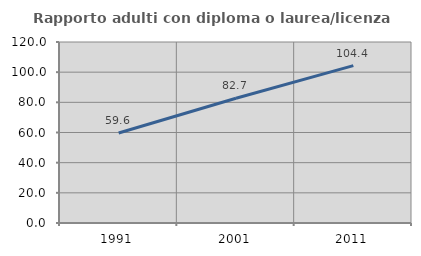
| Category | Rapporto adulti con diploma o laurea/licenza media  |
|---|---|
| 1991.0 | 59.649 |
| 2001.0 | 82.667 |
| 2011.0 | 104.362 |